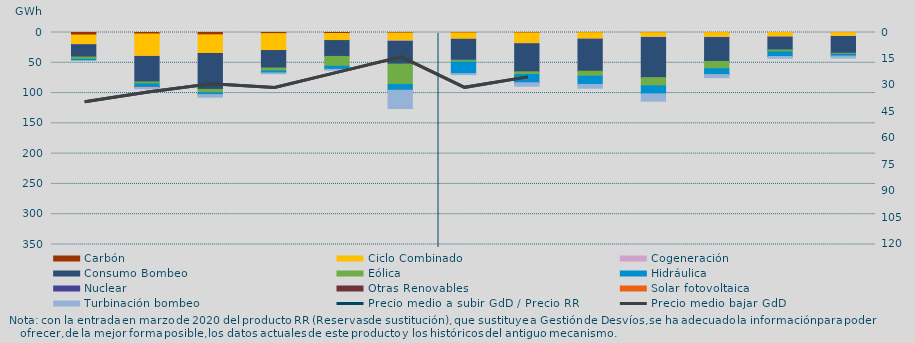
| Category | Carbón | Ciclo Combinado | Cogeneración | Consumo Bombeo | Eólica | Hidráulica | Nuclear | Otras Renovables | Solar fotovoltaica | Turbinación bombeo |
|---|---|---|---|---|---|---|---|---|---|---|
| 0 | 4201.1 | 15848.6 | 69.7 | 20386.2 | 3745.6 | 1086.9 | 0 | 0 | 0 | 0 |
| 1 | 2463.3 | 36768.4 | 333.6 | 42011.2 | 3260.1 | 4994.6 | 253 | 107 | 0 | 2743.5 |
| 2 | 3814.9 | 30904.9 | 78.3 | 59133.4 | 5558 | 2931.3 | 0 | 36.2 | 0 | 4368.3 |
| 3 | 1862.6 | 27837.6 | 96.8 | 28735.2 | 5033.9 | 3139.3 | 0 | 0 | 0 | 1421.7 |
| 4 | 1673.1 | 11548.4 | 106.4 | 26206.5 | 16242.7 | 5014.4 | 0 | 0 | 0 | 1496.4 |
| 5 | 843.6 | 12672 | 969.2 | 37655 | 33849.3 | 9426.5 | 0 | 0 | 57.6 | 30140.7 |
| 6 | 591.9 | 10439.5 | 218.3 | 34537.4 | 3140.7 | 19023.8 | 0 | 0 | 0 | 1658.4 |
| 7 | 683.9 | 17734.4 | 130.3 | 46367.6 | 4484.5 | 13296.6 | 160.1 | 0 | 0 | 5844.4 |
| 8 | 266 | 10455 | 302 | 52908 | 8236.7 | 13611 | 0 | 0 | 0 | 6180 |
| 9 | 248 | 7191 | 798 | 66283 | 13648 | 13179 | 0 | 0 | 0 | 12053 |
| 10 | 93 | 7535.7 | 753.6 | 39389.7 | 12105 | 9573 | 17 | 0 | 101 | 5032 |
| 11 | 66 | 7025.7 | 507 | 21162.5 | 3300.1 | 7480.7 | 105 | 0 | 0 | 2862 |
| 12 | 123 | 5966.1 | 490 | 27694.8 | 1620.1 | 2791 | 87.8 | 0 | 0 | 3441.2 |